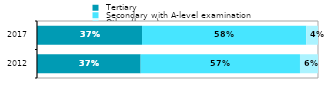
| Category |  Tertiary |  Secondary with A-level examination |  Other (lower) |
|---|---|---|---|
| 2012.0 | 0.369 | 0.567 | 0.064 |
| 2017.0 | 0.374 | 0.585 | 0.042 |